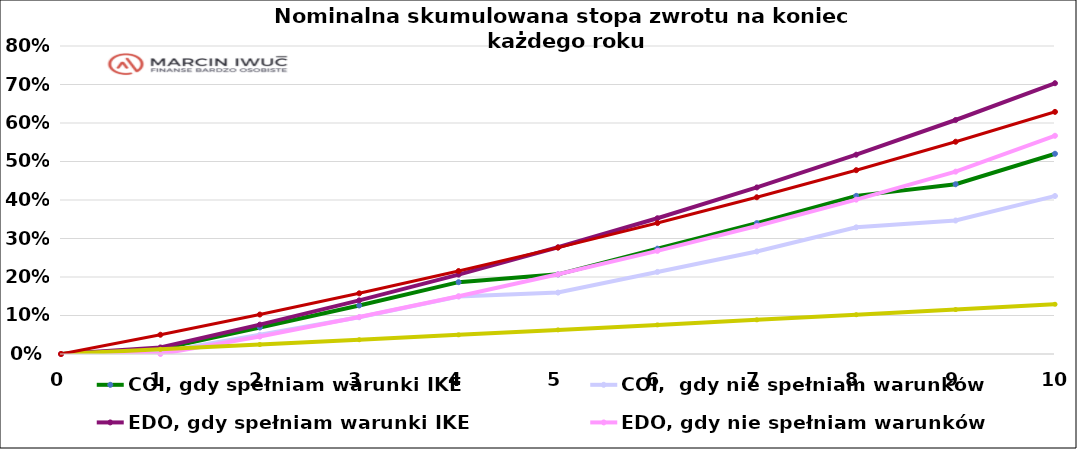
| Category | COI, gdy spełniam warunki IKE | COI,  gdy nie spełniam warunków | EDO, gdy spełniam warunki IKE | EDO, gdy nie spełniam warunków | Konto
oszczędnościowe | INFLACJA |
|---|---|---|---|---|---|---|
| 0.0 | 0 | 0 | 0 | 0 | 0 | 0 |
| 1.0 | 0.013 | 0.005 | 0.017 | 0 | 0.012 | 0.05 |
| 2.0 | 0.069 | 0.05 | 0.076 | 0.045 | 0.025 | 0.103 |
| 3.0 | 0.126 | 0.095 | 0.139 | 0.096 | 0.037 | 0.158 |
| 4.0 | 0.187 | 0.149 | 0.206 | 0.15 | 0.05 | 0.216 |
| 5.0 | 0.207 | 0.16 | 0.277 | 0.207 | 0.063 | 0.276 |
| 6.0 | 0.274 | 0.213 | 0.353 | 0.268 | 0.076 | 0.34 |
| 7.0 | 0.34 | 0.266 | 0.433 | 0.332 | 0.089 | 0.407 |
| 8.0 | 0.411 | 0.329 | 0.518 | 0.401 | 0.102 | 0.477 |
| 9.0 | 0.441 | 0.347 | 0.608 | 0.474 | 0.115 | 0.551 |
| 10.0 | 0.52 | 0.41 | 0.703 | 0.567 | 0.129 | 0.629 |